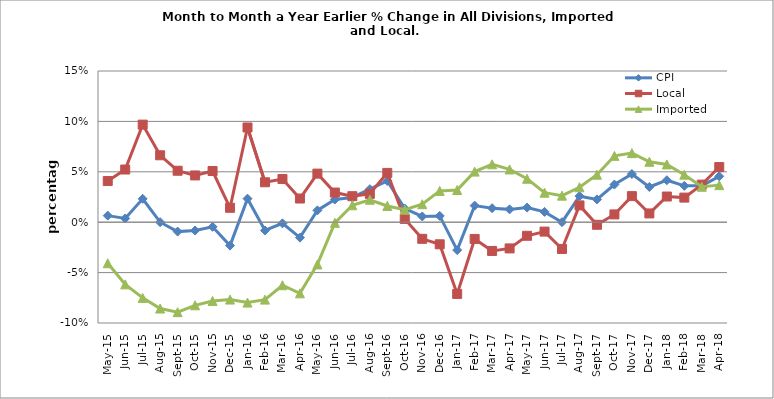
| Category | CPI | Local | Imported |
|---|---|---|---|
| 2015-05-01 | 0.007 | 0.041 | -0.041 |
| 2015-06-01 | 0.004 | 0.052 | -0.062 |
| 2015-07-01 | 0.023 | 0.097 | -0.075 |
| 2015-08-01 | 0 | 0.066 | -0.086 |
| 2015-09-01 | -0.009 | 0.051 | -0.089 |
| 2015-10-01 | -0.008 | 0.046 | -0.082 |
| 2015-11-01 | -0.005 | 0.051 | -0.078 |
| 2015-12-01 | -0.023 | 0.014 | -0.077 |
| 2016-01-01 | 0.023 | 0.094 | -0.08 |
| 2016-02-01 | -0.008 | 0.04 | -0.077 |
| 2016-03-01 | -0.001 | 0.043 | -0.063 |
| 2016-04-01 | -0.015 | 0.023 | -0.071 |
| 2016-05-01 | 0.012 | 0.048 | -0.042 |
| 2016-06-01 | 0.023 | 0.029 | -0.001 |
| 2016-07-01 | 0.025 | 0.026 | 0.017 |
| 2016-08-01 | 0.033 | 0.028 | 0.022 |
| 2016-09-01 | 0.041 | 0.049 | 0.016 |
| 2016-10-01 | 0.014 | 0.003 | 0.012 |
| 2016-11-01 | 0.006 | -0.016 | 0.018 |
| 2016-12-01 | 0.006 | -0.022 | 0.031 |
| 2017-01-01 | -0.028 | -0.071 | 0.032 |
| 2017-02-01 | 0.016 | -0.017 | 0.05 |
| 2017-03-01 | 0.014 | -0.029 | 0.057 |
| 2017-04-01 | 0.013 | -0.026 | 0.052 |
| 2017-05-01 | 0.015 | -0.013 | 0.043 |
| 2017-06-01 | 0.01 | -0.009 | 0.029 |
| 2017-07-01 | 0 | -0.027 | 0.026 |
| 2017-08-01 | 0.026 | 0.017 | 0.035 |
| 2017-09-01 | 0.023 | -0.003 | 0.047 |
| 2017-10-01 | 0.037 | 0.008 | 0.066 |
| 2017-11-01 | 0.048 | 0.026 | 0.069 |
| 2017-12-01 | 0.035 | 0.009 | 0.06 |
| 2018-01-01 | 0.042 | 0.025 | 0.057 |
| 2018-02-01 | 0.036 | 0.024 | 0.047 |
| 2018-03-01 | 0.036 | 0.037 | 0.035 |
| 2018-04-01 | 0.045 | 0.055 | 0.037 |